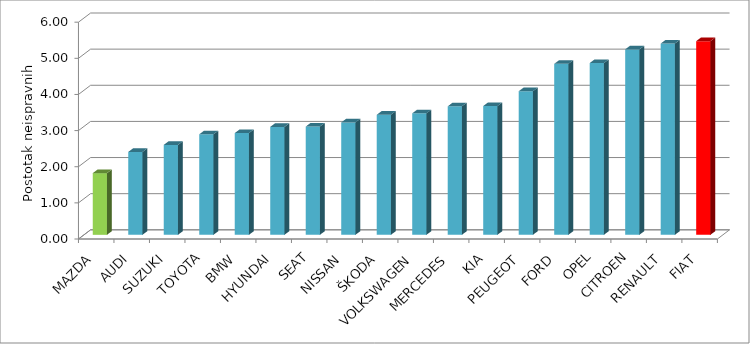
| Category | Series 4 |
|---|---|
| MAZDA | 1.708 |
| AUDI | 2.293 |
| SUZUKI | 2.489 |
| TOYOTA | 2.782 |
| BMW | 2.816 |
| HYUNDAI | 2.987 |
| SEAT | 2.996 |
| NISSAN | 3.11 |
| ŠKODA | 3.322 |
| VOLKSWAGEN | 3.361 |
| MERCEDES | 3.556 |
| KIA | 3.564 |
| PEUGEOT | 3.974 |
| FORD | 4.732 |
| OPEL | 4.754 |
| CITROEN | 5.132 |
| RENAULT | 5.293 |
| FIAT | 5.36 |